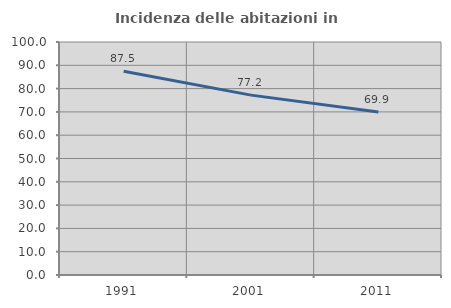
| Category | Incidenza delle abitazioni in proprietà  |
|---|---|
| 1991.0 | 87.452 |
| 2001.0 | 77.197 |
| 2011.0 | 69.93 |